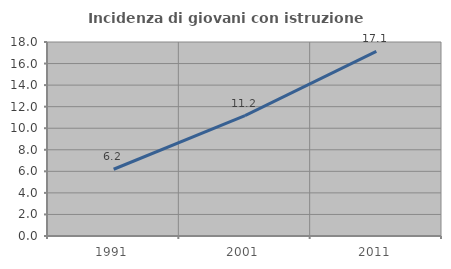
| Category | Incidenza di giovani con istruzione universitaria |
|---|---|
| 1991.0 | 6.194 |
| 2001.0 | 11.165 |
| 2011.0 | 17.13 |